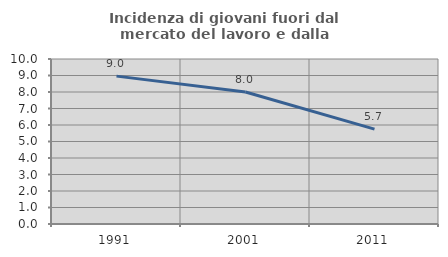
| Category | Incidenza di giovani fuori dal mercato del lavoro e dalla formazione  |
|---|---|
| 1991.0 | 8.962 |
| 2001.0 | 8 |
| 2011.0 | 5.747 |